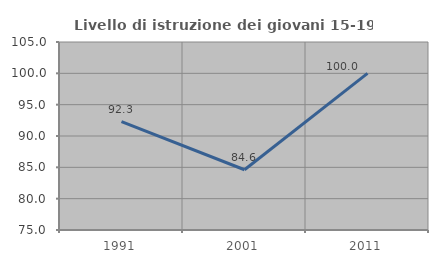
| Category | Livello di istruzione dei giovani 15-19 anni |
|---|---|
| 1991.0 | 92.308 |
| 2001.0 | 84.615 |
| 2011.0 | 100 |